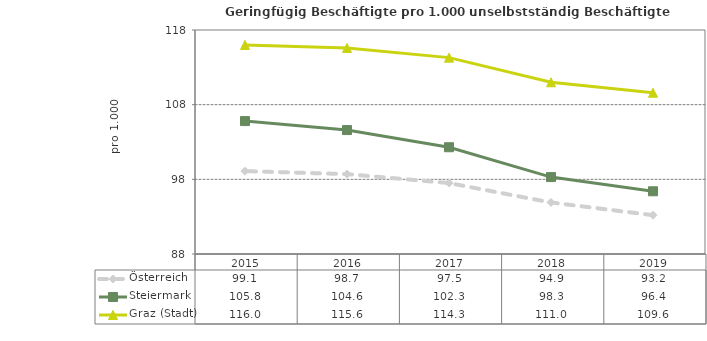
| Category | Österreich | Steiermark | Graz (Stadt) |
|---|---|---|---|
| 2019.0 | 93.2 | 96.4 | 109.6 |
| 2018.0 | 94.9 | 98.3 | 111 |
| 2017.0 | 97.5 | 102.3 | 114.3 |
| 2016.0 | 98.7 | 104.6 | 115.6 |
| 2015.0 | 99.1 | 105.8 | 116 |